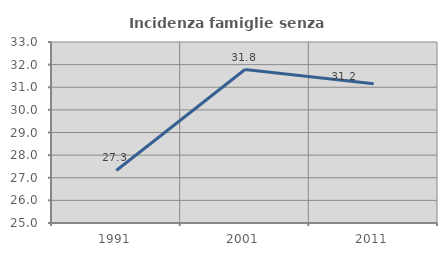
| Category | Incidenza famiglie senza nuclei |
|---|---|
| 1991.0 | 27.322 |
| 2001.0 | 31.784 |
| 2011.0 | 31.153 |